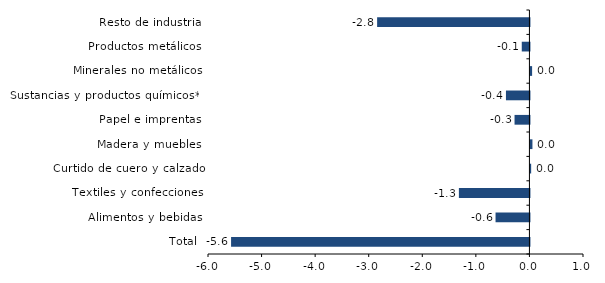
| Category | Series 0 |
|---|---|
| Total | -5.569 |
| Alimentos y bebidas | -0.632 |
| Textiles y confecciones | -1.317 |
| Curtido de cuero y calzado | 0.014 |
| Madera y muebles | 0.038 |
| Papel e imprentas | -0.278 |
| Sustancias y productos químicos** | -0.438 |
| Minerales no metálicos | 0.031 |
| Productos metálicos | -0.143 |
| Resto de industria | -2.843 |